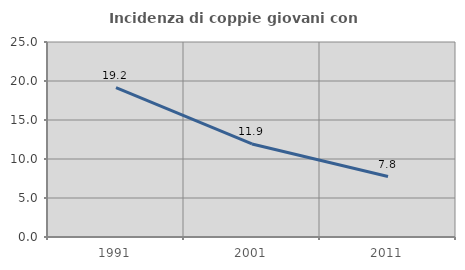
| Category | Incidenza di coppie giovani con figli |
|---|---|
| 1991.0 | 19.151 |
| 2001.0 | 11.93 |
| 2011.0 | 7.753 |